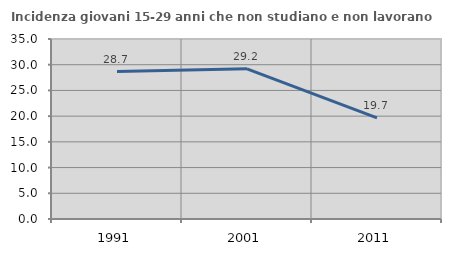
| Category | Incidenza giovani 15-29 anni che non studiano e non lavorano  |
|---|---|
| 1991.0 | 28.659 |
| 2001.0 | 29.195 |
| 2011.0 | 19.679 |